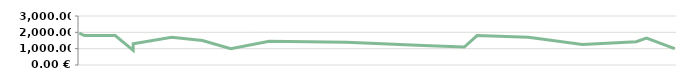
| Category | TULU |
|---|---|
| 2013-04-23 | 1950 |
| 2013-04-25 | 1800 |
| 2013-05-07 | 1800 |
| 2013-05-14 | 900 |
| 2013-05-14 | 1300 |
| 2013-05-29 | 1700 |
| 2013-06-10 | 1500 |
| 2013-06-21 | 1000 |
| 2013-07-06 | 1450 |
| 2013-08-05 | 1400 |
| 2013-08-19 | 1300 |
| 2013-09-04 | 1200 |
| 2013-09-20 | 1100 |
| 2013-09-25 | 1800 |
| 2013-10-15 | 1700 |
| 2013-11-05 | 1250 |
| 2013-11-26 | 1425 |
| 2013-11-30 | 1650 |
| 2013-12-11 | 1000 |